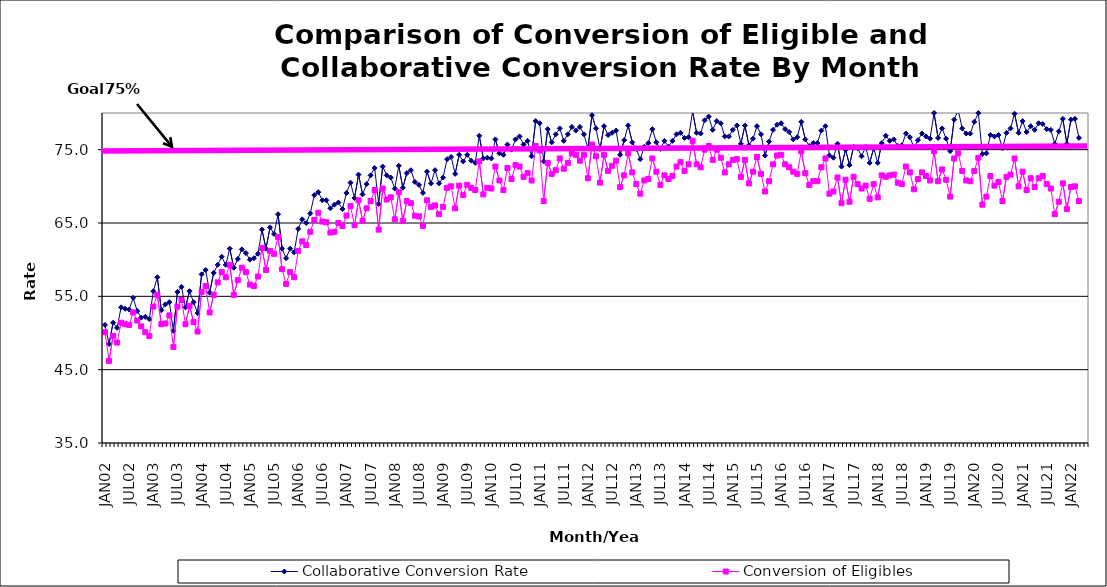
| Category | Collaborative Conversion Rate | Conversion of Eligibles |
|---|---|---|
| JAN02 | 51.1 | 50.1 |
| FEB02 | 48.5 | 46.2 |
| MAR02 | 51.4 | 49.6 |
| APR02 | 50.7 | 48.7 |
| MAY02 | 53.5 | 51.4 |
| JUN02 | 53.3 | 51.2 |
| JUL02 | 53.2 | 51.1 |
| AUG02 | 54.8 | 52.8 |
| SEP02 | 53 | 51.7 |
| OCT02 | 52.1 | 50.9 |
| NOV02 | 52.2 | 50.1 |
| DEC02 | 51.9 | 49.6 |
| JAN03 | 55.7 | 53.6 |
| FEB03 | 57.6 | 55.2 |
| MAR03 | 53.1 | 51.2 |
| APR03 | 53.9 | 51.3 |
| MAY03 | 54.2 | 52.4 |
| JUN03 | 50.3 | 48.1 |
| JUL03 | 55.6 | 53.6 |
| AUG03 | 56.3 | 54.5 |
| SEP03 | 53.5 | 51.2 |
| OCT03 | 55.7 | 53.7 |
| NOV03 | 54.2 | 51.5 |
| DEC03 | 52.7 | 50.2 |
| JAN04 | 58 | 55.6 |
| FEB04 | 58.6 | 56.4 |
| MAR04 | 55.5 | 52.8 |
| APR04 | 58.2 | 55.2 |
| MAY04 | 59.3 | 56.9 |
| JUN04 | 60.4 | 58.3 |
| JUL04 | 59.3 | 57.6 |
| AUG04 | 61.5 | 59.3 |
| SEP04 | 58.9 | 55.2 |
| OCT04 | 60.1 | 57.2 |
| NOV04 | 61.4 | 58.9 |
| DEC04 | 60.9 | 58.3 |
| JAN05 | 60 | 56.6 |
| FEB05 | 60.2 | 56.4 |
| MAR05 | 60.8 | 57.7 |
| APR05 | 64.1 | 61.6 |
| MAY05 | 61.5 | 58.6 |
| JUN05 | 64.4 | 61.2 |
| JUL05 | 63.5 | 60.8 |
| AUG05 | 66.2 | 63.1 |
| SEP05 | 61.5 | 58.7 |
| OCT05 | 60.2 | 56.7 |
| NOV05 | 61.5 | 58.3 |
| DEC05 | 61 | 57.6 |
| JAN06 | 64.2 | 61.2 |
| FEB06 | 65.5 | 62.5 |
| MAR06 | 65 | 62 |
| APR06 | 66.3 | 63.8 |
| MAY06 | 68.8 | 65.4 |
| JUN06 | 69.2 | 66.4 |
| JUL06 | 68.1 | 65.2 |
| AUG06 | 68.1 | 65.1 |
| SEP06 | 67 | 63.7 |
| OCT06 | 67.5 | 63.8 |
| NOV06 | 67.8 | 65 |
| DEC06 | 66.9 | 64.6 |
| JAN07 | 69.1 | 66 |
| FEB07 | 70.5 | 67.3 |
| MAR07 | 68.4 | 64.7 |
| APR07 | 71.6 | 68.1 |
| MAY07 | 68.9 | 65.3 |
| JUN07 | 70.3 | 67 |
| JUL07 | 71.5 | 68 |
| AUG07 | 72.5 | 69.5 |
| SEP07 | 67.6 | 64.1 |
| OCT07 | 72.7 | 69.7 |
| NOV07 | 71.5 | 68.2 |
| DEC07 | 71.2 | 68.5 |
| JAN08 | 69.7 | 65.5 |
| FEB08 | 72.8 | 69.2 |
| MAR08 | 69.8 | 65.3 |
| APR08 | 71.8 | 68 |
| MAY08 | 72.2 | 67.7 |
| JUN08 | 70.6 | 66 |
| JUL08 | 70.2 | 65.9 |
| AUG08 | 69.1 | 64.6 |
| SEP08 | 72 | 68.1 |
| OCT08 | 70.4 | 67.2 |
| NOV08 | 72.2 | 67.4 |
| DEC08 | 70.4 | 66.2 |
| JAN09 | 71.2 | 67.2 |
| FEB09 | 73.7 | 69.8 |
| MAR09 | 74 | 70 |
| APR09 | 71.7 | 67 |
| MAY09 | 74.3 | 70.1 |
| JUN09 | 73.4 | 68.8 |
| JUL09 | 74.3 | 70.2 |
| AUG09 | 73.5 | 69.8 |
| SEP09 | 73.2 | 69.5 |
| OCT09 | 76.9 | 73.4 |
| NOV09 | 73.8 | 68.9 |
| DEC09 | 73.9 | 69.8 |
| JAN10 | 73.8 | 69.7 |
| FEB10 | 76.4 | 72.7 |
| MAR10 | 74.5 | 70.8 |
| APR10 | 74.3 | 69.5 |
| MAY10 | 75.7 | 72.5 |
| JUN10 | 75 | 71 |
| JUL10 | 76.4 | 72.9 |
| AUG10 | 76.8 | 72.7 |
| SEP10 | 75.7 | 71.3 |
| OCT10 | 76.2 | 71.8 |
| NOV10 | 74.1 | 70.8 |
| DEC10 | 78.9 | 75.5 |
| JAN11 | 78.6 | 74.9 |
| FEB11 | 73.4 | 68 |
| MAR11 | 77.8 | 73.2 |
| APR11 | 76 | 71.7 |
| MAY11 | 77.1 | 72.2 |
| JUN11 | 77.9 | 73.8 |
| JUL11 | 76.2 | 72.4 |
| AUG11 | 77.1 | 73.2 |
| SEP11 | 78.1 | 74.5 |
| OCT11 | 77.6 | 74.3 |
| NOV11 | 78.1 | 73.5 |
| DEC11 | 77.1 | 74.3 |
| JAN12 | 75.2 | 71.1 |
| FEB12 | 79.7 | 75.7 |
| MAR12 | 77.9 | 74.1 |
| APR12 | 75.1 | 70.5 |
| MAY12 | 78.2 | 74.3 |
| JUN12 | 77 | 72.1 |
| JUL12 | 77.3 | 72.8 |
| AUG12 | 77.6 | 73.5 |
| SEP12 | 74.3 | 69.9 |
| OCT12 | 76.3 | 71.5 |
| NOV12 | 78.3 | 74.5 |
| DEC12 | 76 | 71.9 |
| JAN13 | 75.1 | 70.3 |
| FEB13 | 73.7 | 69 |
| MAR13 | 75.4 | 70.8 |
| APR13 | 75.9 | 71 |
| MAY13 | 77.8 | 73.8 |
| JUN13 | 76 | 72 |
| JUL13 | 75.1 | 70.2 |
| AUG13 | 76.2 | 71.5 |
| SEP13 | 75.4 | 71 |
| OCT13 | 76.2 | 71.4 |
| NOV13 | 77.1 | 72.7 |
| DEC13 | 77.3 | 73.3 |
| JAN14 | 76.6 | 72.1 |
| FEB14 | 76.7 | 73 |
| MAR14 | 80.2 | 76.2 |
| APR14 | 77.3 | 73 |
| MAY14 | 77.2 | 72.6 |
| JUN14 | 79 | 75 |
| JUL14 | 79.5 | 75.5 |
| AUG14 | 77.7 | 73.6 |
| SEP14 | 78.9 | 75 |
| OCT14 | 78.6 | 73.9 |
| NOV14 | 76.8 | 71.9 |
| DEC14 | 76.8 | 73 |
| JAN15 | 77.7 | 73.6 |
| FEB15 | 78.3 | 73.7 |
| MAR15 | 75.8 | 71.3 |
| APR15 | 78.3 | 73.6 |
| MAY15 | 75.6 | 70.4 |
| JUN15 | 76.5 | 72 |
| JUL15 | 78.2 | 74 |
| AUG15 | 77.1 | 71.7 |
| SEP15 | 74.2 | 69.3 |
| OCT15 | 76.1 | 70.7 |
| NOV15 | 77.7 | 73 |
| DEC15 | 78.4 | 74.2 |
| JAN16 | 78.6 | 74.3 |
| FEB16 | 77.8 | 73 |
| MAR16 | 77.4 | 72.6 |
| APR16 | 76.4 | 72 |
| MAY16 | 76.7 | 71.7 |
| JUN16 | 78.8 | 74.8 |
| JUL16 | 76.4 | 71.8 |
| AUG16 | 75.5 | 70.2 |
| SEP16 | 75.9 | 70.7 |
| OCT16 | 75.9 | 70.7 |
| NOV16 | 77.6 | 72.6 |
| DEC16 | 78.2 | 73.8 |
| JAN17 | 74.2 | 69 |
| FEB17 | 73.9 | 69.3 |
| MAR17 | 75.8 | 71.2 |
| APR17 | 72.7 | 67.7 |
| MAY17 | 75 | 70.9 |
| JUN17 | 72.9 | 67.9 |
| JUL17 | 75.4 | 71.3 |
| AUG17 | 75.2 | 70.3 |
| SEP17 | 74.1 | 69.7 |
| OCT17 | 75.4 | 70.1 |
| NOV17 | 73.2 | 68.3 |
| DEC17 | 75.2 | 70.3 |
| JAN18 | 73.2 | 68.5 |
| FEB18 | 75.9 | 71.5 |
| MAR18 | 76.9 | 71.3 |
| APR18 | 76.2 | 71.5 |
| MAY18 | 76.4 | 71.6 |
| JUN18 | 75.5 | 70.5 |
| JUL18 | 75.6 | 70.3 |
| AUG18 | 77.2 | 72.7 |
| SEP18 | 76.7 | 71.9 |
| OCT18 | 75.3 | 69.6 |
| NOV18 | 76.3 | 71 |
| DEC18 | 77.2 | 71.9 |
| JAN19 | 76.8 | 71.4 |
| FEB19 | 76.5 | 70.8 |
| MAR19 | 80 | 74.8 |
| APR19 | 76.6 | 70.7 |
| MAY19 | 77.9 | 72.3 |
| JUN19 | 76.5 | 70.9 |
| JUL19 | 74.8 | 68.6 |
| AUG19 | 79.1 | 73.8 |
| SEP19 | 80.4 | 74.5 |
| OCT19 | 77.9 | 72.1 |
| NOV19 | 77.2 | 70.8 |
| DEC19 | 77.2 | 70.7 |
| JAN20 | 78.8 | 72.1 |
| FEB20 | 80 | 73.9 |
| MAR20 | 74.4 | 67.5 |
| APR20 | 74.5 | 68.6 |
| MAY20 | 77 | 71.4 |
| JUN20 | 76.8 | 70.1 |
| JUL20 | 77 | 70.6 |
| AUG20 | 75.2 | 68 |
| SEP20 | 77.3 | 71.3 |
| OCT20 | 77.9 | 71.6 |
| NOV20 | 79.9 | 73.8 |
| DEC20 | 77.3 | 70 |
| JAN21 | 78.9 | 72 |
| FEB21 | 77.4 | 69.5 |
| MAR21 | 78.2 | 71.1 |
| APR21 | 77.7 | 69.9 |
| MAY21 | 78.6 | 71.1 |
| JUN21 | 78.5 | 71.4 |
| JUL21 | 77.8 | 70.3 |
| AUG21 | 77.7 | 69.7 |
| SEP21 | 75.8 | 66.2 |
| OCT21 | 77.5 | 67.9 |
| NOV21 | 79.2 | 70.4 |
| DEC21 | 75.8 | 66.9 |
| JAN22 | 79.1 | 69.9 |
| FEB22 | 79.2 | 70 |
| MAR22 | 76.6 | 68 |